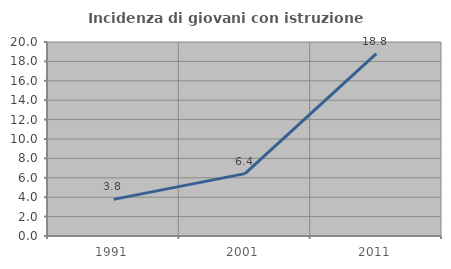
| Category | Incidenza di giovani con istruzione universitaria |
|---|---|
| 1991.0 | 3.774 |
| 2001.0 | 6.429 |
| 2011.0 | 18.812 |